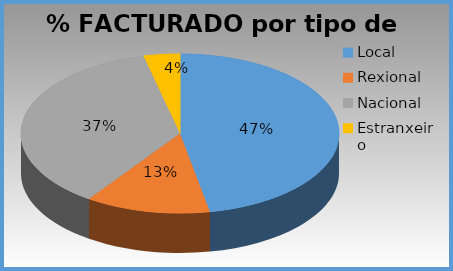
| Category | % facturado |
|---|---|
| Local | 0.47 |
| Rexional | 0.127 |
| Nacional | 0.366 |
| Estranxeiro | 0.037 |